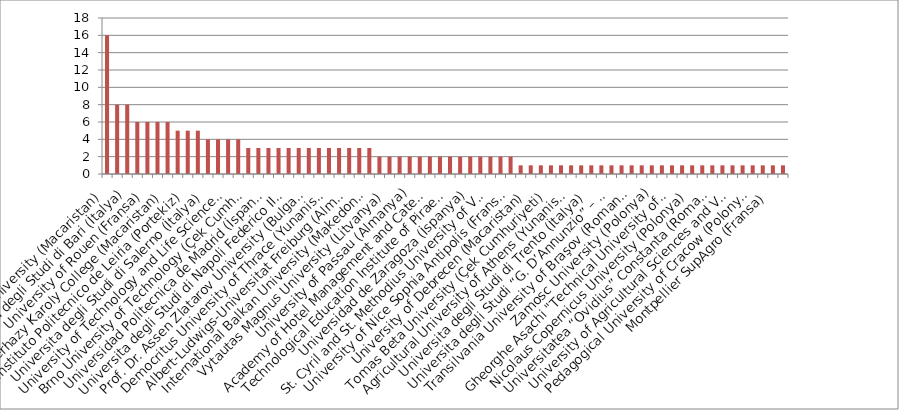
| Category | Series 0 |
|---|---|
| Szent Istvan University (Macaristan) | 16 |
| Agricultural University – Plovdiv (Bulgaristan) | 8 |
| Universita degli Studi di Bari (İtalya) | 8 |
| University of Thessaly (Yunanistan) | 6 |
| University of Rouen (Fransa) | 6 |
| University of Kassel (Almanya) | 6 |
| Esterhazy Karoly College (Macaristan) | 6 |
| Universita degli Studi della Tuscia (İtalya) | 5 |
| Instituto Politecnico de Leiria (Portekiz) | 5 |
| Instituto Politecnico de Coimbra (Portekiz) | 5 |
| Universita degli Studi di Salerno (İtalya) | 4 |
| Technical University of Lodz (Polonya) | 4 |
| University of Technology and Life Sciences (Polonya) | 4 |
| University of Pisa (İtalya) | 4 |
| Brno University of Technology (Çek Cumhuriyeti) | 3 |
| Trakia University - Stara Zagora (Bulgaristan) | 3 |
| Universidad Politecnica de Madrid (İspanya) | 3 |
| Kaunas University of Technology (Litvanya) | 3 |
| Universita degli Studi di Napoli Federico II (İtalya) | 3 |
| University of Agribusiness and Rural Development (Bulgaristan) | 3 |
| Prof. Dr. Assen Zlatarov University (Bulgaristan) | 3 |
| AGH University of Science and Technology (Polonya) | 3 |
| Democritus University of Thrace (Yunanistan) | 3 |
| University of Bielsko Biela (Polonya) | 3 |
| Albert-Ludwigs-Universitat Freiburg (Almanya) | 3 |
| University of Ljubljana (Slovenya) | 3 |
| International Balkan University (Makedonya) | 3 |
| Aristotle University of Thessaloniki (Yunanistan) | 2 |
| Vytautas Magnus University (Litvanya) | 2 |
| University of Hohenheim (Almanya) | 2 |
| University of Passau (Almanya) | 2 |
| Angel Kanchev University of Rousse (Bulgaristan) | 2 |
| Academy of Hotel Management and Catering Industry – Poznan (Polonya) | 2 |
| Vilnius College of Design & Technologies (Litvanya) | 2 |
| Technological Education Institute of Piraeus (Yunanistan) | 2 |
| Johannes Kepler University (Avusturya) | 2 |
| Universidad de Zaragoza (İspanya) | 2 |
| University of Minho (Portekiz) | 2 |
| St. Cyril and St. Methodius University of Veliko Turnovo (Bulgaristan) | 2 |
| Gr. T. Popa University of Medicine and Pharmacy of Iasi (Romanya) | 2 |
| University of Nice Sophia Antipolis (Fransa) | 2 |
| University of Bonn (Almanya) | 1 |
| University of Debrecen (Macaristan) | 1 |
| Politechnic University of Valencia (İspanya) | 1 |
| Tomas Beta University (Çek Cumhuriyeti) | 1 |
| Panevezys College (Litvanya) | 1 |
| Agricultural University of Athens (Yunanistan) | 1 |
| Ponzan University of Technology (Polonya) | 1 |
| Universita degli Studi di Trento (İtalya) | 1 |
| Medical University – Plovdiv (Bulgaristan) | 1 |
| Universita degli Studi “G. D’Annunzio” – Chieti – Pescara (İtalya) | 1 |
| Technical University of Crete (Yunanistan) | 1 |
| Transilvania University of Braşov (Romanya) | 1 |
| University of Pécs (Macaristan) | 1 |
| Zamosc University (Polonya) | 1 |
| Universitatea "Dunarea De Jos" Din Galati (Romanya) | 1 |
| Gheorghe Asachi "Technical University of Iasi (Romanya) | 1 |
| University of Hamburg (Almanya) | 1 |
| Nicolaus Copernicus University (Polonya) | 1 |
| Justus Liebig University Giessen (Almanya) | 1 |
| Universitatea “Ovidius” Constanta (Romanya) | 1 |
| University of Gavle (İsveç) | 1 |
| University of Agricultural Sciences and Veterinary Medicine of Cluj (Romanya) | 1 |
| RWTH Aachen University (Almanya) | 1 |
| Pedagogical University of Cracow (Polonya) | 1 |
| Eberhard-Karls-Universität Tübingen (Almanya) | 1 |
| Montpellier SupAgro (Fransa) | 1 |
| State University of Tetova (Makedonya) | 1 |